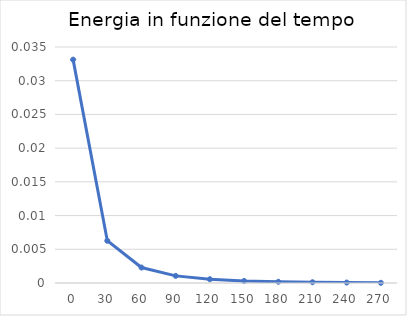
| Category | Series 0 |
|---|---|
| 0.0 | 0.033 |
| 30.0 | 0.006 |
| 60.0 | 0.002 |
| 90.0 | 0.001 |
| 120.0 | 0.001 |
| 150.0 | 0 |
| 180.0 | 0 |
| 210.0 | 0 |
| 240.0 | 0 |
| 270.0 | 0 |